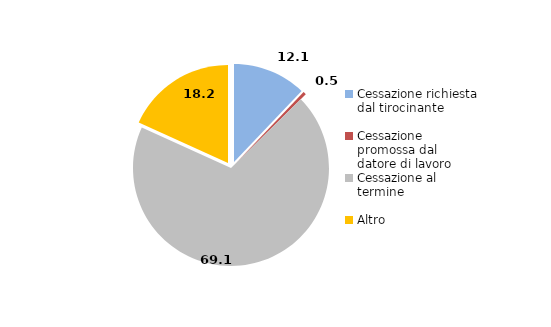
| Category | Series 0 |
|---|---|
| Cessazione richiesta dal tirocinante | 12.1 |
| Cessazione promossa dal datore di lavoro | 0.5 |
| Cessazione al termine | 69.1 |
| Altro | 18.2 |